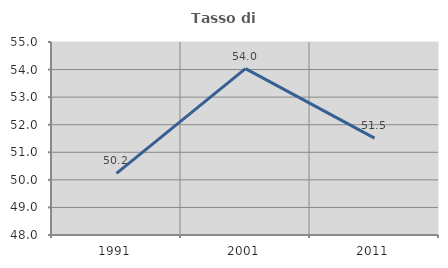
| Category | Tasso di occupazione   |
|---|---|
| 1991.0 | 50.234 |
| 2001.0 | 54.032 |
| 2011.0 | 51.515 |